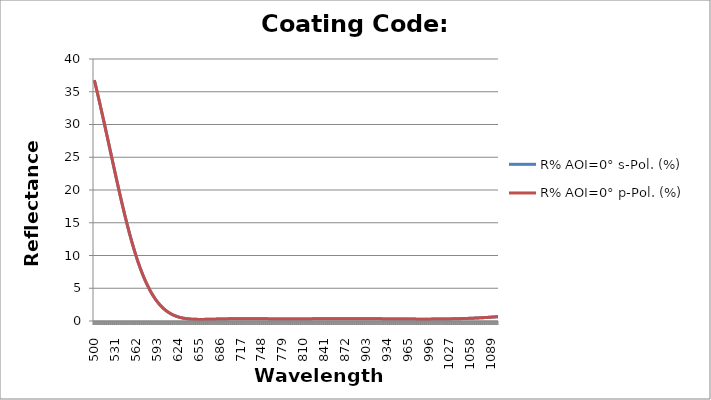
| Category | R% AOI=0° s-Pol. (%) | R% AOI=0° p-Pol. (%) |
|---|---|---|
| 500.0 | 36.773 | 36.773 |
| 501.0 | 36.354 | 36.354 |
| 502.0 | 35.929 | 35.929 |
| 503.0 | 35.499 | 35.499 |
| 504.0 | 35.064 | 35.064 |
| 505.0 | 34.623 | 34.623 |
| 506.0 | 34.178 | 34.178 |
| 507.0 | 33.729 | 33.729 |
| 508.0 | 33.275 | 33.275 |
| 509.0 | 32.817 | 32.817 |
| 510.0 | 32.355 | 32.355 |
| 511.0 | 31.903 | 31.903 |
| 512.0 | 31.448 | 31.448 |
| 513.0 | 30.989 | 30.989 |
| 514.0 | 30.528 | 30.528 |
| 515.0 | 30.065 | 30.065 |
| 516.0 | 29.6 | 29.6 |
| 517.0 | 29.132 | 29.132 |
| 518.0 | 28.663 | 28.663 |
| 519.0 | 28.192 | 28.192 |
| 520.0 | 27.72 | 27.72 |
| 521.0 | 27.248 | 27.248 |
| 522.0 | 26.774 | 26.774 |
| 523.0 | 26.3 | 26.3 |
| 524.0 | 25.826 | 25.826 |
| 525.0 | 25.353 | 25.353 |
| 526.0 | 24.879 | 24.879 |
| 527.0 | 24.406 | 24.406 |
| 528.0 | 23.934 | 23.934 |
| 529.0 | 23.463 | 23.463 |
| 530.0 | 22.993 | 22.993 |
| 531.0 | 22.525 | 22.525 |
| 532.0 | 22.059 | 22.059 |
| 533.0 | 21.594 | 21.594 |
| 534.0 | 21.132 | 21.132 |
| 535.0 | 20.673 | 20.673 |
| 536.0 | 20.216 | 20.216 |
| 537.0 | 19.762 | 19.762 |
| 538.0 | 19.312 | 19.312 |
| 539.0 | 18.865 | 18.865 |
| 540.0 | 18.421 | 18.421 |
| 541.0 | 17.981 | 17.981 |
| 542.0 | 17.546 | 17.546 |
| 543.0 | 17.114 | 17.114 |
| 544.0 | 16.687 | 16.687 |
| 545.0 | 16.264 | 16.264 |
| 546.0 | 15.846 | 15.846 |
| 547.0 | 15.433 | 15.433 |
| 548.0 | 15.025 | 15.025 |
| 549.0 | 14.622 | 14.622 |
| 550.0 | 14.224 | 14.224 |
| 551.0 | 13.833 | 13.833 |
| 552.0 | 13.447 | 13.447 |
| 553.0 | 13.066 | 13.066 |
| 554.0 | 12.692 | 12.692 |
| 555.0 | 12.323 | 12.323 |
| 556.0 | 11.96 | 11.96 |
| 557.0 | 11.604 | 11.604 |
| 558.0 | 11.253 | 11.253 |
| 559.0 | 10.909 | 10.909 |
| 560.0 | 10.571 | 10.571 |
| 561.0 | 10.239 | 10.239 |
| 562.0 | 9.914 | 9.914 |
| 563.0 | 9.595 | 9.595 |
| 564.0 | 9.283 | 9.283 |
| 565.0 | 8.977 | 8.977 |
| 566.0 | 8.678 | 8.678 |
| 567.0 | 8.385 | 8.385 |
| 568.0 | 8.099 | 8.099 |
| 569.0 | 7.822 | 7.822 |
| 570.0 | 7.552 | 7.552 |
| 571.0 | 7.289 | 7.289 |
| 572.0 | 7.031 | 7.031 |
| 573.0 | 6.78 | 6.78 |
| 574.0 | 6.535 | 6.535 |
| 575.0 | 6.297 | 6.297 |
| 576.0 | 6.064 | 6.064 |
| 577.0 | 5.838 | 5.838 |
| 578.0 | 5.618 | 5.618 |
| 579.0 | 5.404 | 5.404 |
| 580.0 | 5.196 | 5.196 |
| 581.0 | 4.994 | 4.994 |
| 582.0 | 4.797 | 4.797 |
| 583.0 | 4.607 | 4.607 |
| 584.0 | 4.422 | 4.422 |
| 585.0 | 4.243 | 4.243 |
| 586.0 | 4.069 | 4.069 |
| 587.0 | 3.901 | 3.901 |
| 588.0 | 3.738 | 3.738 |
| 589.0 | 3.581 | 3.581 |
| 590.0 | 3.428 | 3.428 |
| 591.0 | 3.281 | 3.281 |
| 592.0 | 3.139 | 3.139 |
| 593.0 | 3.002 | 3.002 |
| 594.0 | 2.869 | 2.869 |
| 595.0 | 2.741 | 2.741 |
| 596.0 | 2.618 | 2.618 |
| 597.0 | 2.499 | 2.499 |
| 598.0 | 2.385 | 2.385 |
| 599.0 | 2.275 | 2.275 |
| 600.0 | 2.17 | 2.17 |
| 601.0 | 2.068 | 2.068 |
| 602.0 | 1.97 | 1.97 |
| 603.0 | 1.877 | 1.877 |
| 604.0 | 1.787 | 1.787 |
| 605.0 | 1.701 | 1.701 |
| 606.0 | 1.618 | 1.618 |
| 607.0 | 1.539 | 1.539 |
| 608.0 | 1.463 | 1.463 |
| 609.0 | 1.391 | 1.391 |
| 610.0 | 1.322 | 1.322 |
| 611.0 | 1.256 | 1.256 |
| 612.0 | 1.193 | 1.193 |
| 613.0 | 1.133 | 1.133 |
| 614.0 | 1.076 | 1.076 |
| 615.0 | 1.021 | 1.021 |
| 616.0 | 0.969 | 0.969 |
| 617.0 | 0.92 | 0.92 |
| 618.0 | 0.873 | 0.873 |
| 619.0 | 0.829 | 0.829 |
| 620.0 | 0.787 | 0.787 |
| 621.0 | 0.747 | 0.747 |
| 622.0 | 0.71 | 0.71 |
| 623.0 | 0.674 | 0.674 |
| 624.0 | 0.64 | 0.64 |
| 625.0 | 0.609 | 0.609 |
| 626.0 | 0.579 | 0.579 |
| 627.0 | 0.551 | 0.551 |
| 628.0 | 0.525 | 0.525 |
| 629.0 | 0.5 | 0.5 |
| 630.0 | 0.477 | 0.477 |
| 631.0 | 0.455 | 0.455 |
| 632.0 | 0.435 | 0.435 |
| 633.0 | 0.416 | 0.416 |
| 634.0 | 0.399 | 0.399 |
| 635.0 | 0.382 | 0.382 |
| 636.0 | 0.367 | 0.367 |
| 637.0 | 0.354 | 0.354 |
| 638.0 | 0.341 | 0.341 |
| 639.0 | 0.329 | 0.329 |
| 640.0 | 0.318 | 0.318 |
| 641.0 | 0.308 | 0.308 |
| 642.0 | 0.3 | 0.3 |
| 643.0 | 0.292 | 0.292 |
| 644.0 | 0.284 | 0.284 |
| 645.0 | 0.278 | 0.278 |
| 646.0 | 0.272 | 0.272 |
| 647.0 | 0.267 | 0.267 |
| 648.0 | 0.262 | 0.262 |
| 649.0 | 0.258 | 0.258 |
| 650.0 | 0.255 | 0.255 |
| 651.0 | 0.252 | 0.252 |
| 652.0 | 0.25 | 0.25 |
| 653.0 | 0.248 | 0.248 |
| 654.0 | 0.246 | 0.246 |
| 655.0 | 0.245 | 0.245 |
| 656.0 | 0.244 | 0.244 |
| 657.0 | 0.244 | 0.244 |
| 658.0 | 0.244 | 0.244 |
| 659.0 | 0.244 | 0.244 |
| 660.0 | 0.244 | 0.244 |
| 661.0 | 0.245 | 0.245 |
| 662.0 | 0.246 | 0.246 |
| 663.0 | 0.247 | 0.247 |
| 664.0 | 0.249 | 0.249 |
| 665.0 | 0.25 | 0.25 |
| 666.0 | 0.252 | 0.252 |
| 667.0 | 0.254 | 0.254 |
| 668.0 | 0.256 | 0.256 |
| 669.0 | 0.258 | 0.258 |
| 670.0 | 0.26 | 0.26 |
| 671.0 | 0.262 | 0.262 |
| 672.0 | 0.265 | 0.265 |
| 673.0 | 0.267 | 0.267 |
| 674.0 | 0.27 | 0.27 |
| 675.0 | 0.272 | 0.272 |
| 676.0 | 0.274 | 0.274 |
| 677.0 | 0.277 | 0.277 |
| 678.0 | 0.28 | 0.28 |
| 679.0 | 0.282 | 0.282 |
| 680.0 | 0.285 | 0.285 |
| 681.0 | 0.287 | 0.287 |
| 682.0 | 0.29 | 0.29 |
| 683.0 | 0.292 | 0.292 |
| 684.0 | 0.295 | 0.295 |
| 685.0 | 0.297 | 0.297 |
| 686.0 | 0.3 | 0.3 |
| 687.0 | 0.302 | 0.302 |
| 688.0 | 0.304 | 0.304 |
| 689.0 | 0.307 | 0.307 |
| 690.0 | 0.309 | 0.309 |
| 691.0 | 0.311 | 0.311 |
| 692.0 | 0.313 | 0.313 |
| 693.0 | 0.315 | 0.315 |
| 694.0 | 0.317 | 0.317 |
| 695.0 | 0.319 | 0.319 |
| 696.0 | 0.321 | 0.321 |
| 697.0 | 0.322 | 0.322 |
| 698.0 | 0.324 | 0.324 |
| 699.0 | 0.326 | 0.326 |
| 700.0 | 0.327 | 0.327 |
| 701.0 | 0.328 | 0.328 |
| 702.0 | 0.33 | 0.33 |
| 703.0 | 0.331 | 0.331 |
| 704.0 | 0.332 | 0.332 |
| 705.0 | 0.334 | 0.334 |
| 706.0 | 0.335 | 0.335 |
| 707.0 | 0.336 | 0.336 |
| 708.0 | 0.336 | 0.336 |
| 709.0 | 0.337 | 0.337 |
| 710.0 | 0.338 | 0.338 |
| 711.0 | 0.339 | 0.339 |
| 712.0 | 0.339 | 0.339 |
| 713.0 | 0.34 | 0.34 |
| 714.0 | 0.34 | 0.34 |
| 715.0 | 0.341 | 0.341 |
| 716.0 | 0.341 | 0.341 |
| 717.0 | 0.342 | 0.342 |
| 718.0 | 0.342 | 0.342 |
| 719.0 | 0.342 | 0.342 |
| 720.0 | 0.342 | 0.342 |
| 721.0 | 0.342 | 0.342 |
| 722.0 | 0.342 | 0.342 |
| 723.0 | 0.342 | 0.342 |
| 724.0 | 0.342 | 0.342 |
| 725.0 | 0.342 | 0.342 |
| 726.0 | 0.342 | 0.342 |
| 727.0 | 0.342 | 0.342 |
| 728.0 | 0.341 | 0.341 |
| 729.0 | 0.341 | 0.341 |
| 730.0 | 0.341 | 0.341 |
| 731.0 | 0.34 | 0.34 |
| 732.0 | 0.34 | 0.34 |
| 733.0 | 0.34 | 0.34 |
| 734.0 | 0.339 | 0.339 |
| 735.0 | 0.339 | 0.339 |
| 736.0 | 0.338 | 0.338 |
| 737.0 | 0.338 | 0.338 |
| 738.0 | 0.337 | 0.337 |
| 739.0 | 0.337 | 0.337 |
| 740.0 | 0.336 | 0.336 |
| 741.0 | 0.336 | 0.336 |
| 742.0 | 0.335 | 0.335 |
| 743.0 | 0.334 | 0.334 |
| 744.0 | 0.334 | 0.334 |
| 745.0 | 0.333 | 0.333 |
| 746.0 | 0.333 | 0.333 |
| 747.0 | 0.332 | 0.332 |
| 748.0 | 0.331 | 0.331 |
| 749.0 | 0.33 | 0.33 |
| 750.0 | 0.33 | 0.33 |
| 751.0 | 0.329 | 0.329 |
| 752.0 | 0.328 | 0.328 |
| 753.0 | 0.327 | 0.327 |
| 754.0 | 0.327 | 0.327 |
| 755.0 | 0.326 | 0.326 |
| 756.0 | 0.325 | 0.325 |
| 757.0 | 0.325 | 0.325 |
| 758.0 | 0.324 | 0.324 |
| 759.0 | 0.323 | 0.323 |
| 760.0 | 0.323 | 0.323 |
| 761.0 | 0.322 | 0.322 |
| 762.0 | 0.321 | 0.321 |
| 763.0 | 0.321 | 0.321 |
| 764.0 | 0.32 | 0.32 |
| 765.0 | 0.32 | 0.32 |
| 766.0 | 0.319 | 0.319 |
| 767.0 | 0.318 | 0.318 |
| 768.0 | 0.318 | 0.318 |
| 769.0 | 0.318 | 0.318 |
| 770.0 | 0.317 | 0.317 |
| 771.0 | 0.317 | 0.317 |
| 772.0 | 0.316 | 0.316 |
| 773.0 | 0.316 | 0.316 |
| 774.0 | 0.315 | 0.315 |
| 775.0 | 0.315 | 0.315 |
| 776.0 | 0.315 | 0.315 |
| 777.0 | 0.314 | 0.314 |
| 778.0 | 0.314 | 0.314 |
| 779.0 | 0.314 | 0.314 |
| 780.0 | 0.314 | 0.314 |
| 781.0 | 0.314 | 0.314 |
| 782.0 | 0.313 | 0.313 |
| 783.0 | 0.313 | 0.313 |
| 784.0 | 0.313 | 0.313 |
| 785.0 | 0.313 | 0.313 |
| 786.0 | 0.313 | 0.313 |
| 787.0 | 0.313 | 0.313 |
| 788.0 | 0.313 | 0.313 |
| 789.0 | 0.313 | 0.313 |
| 790.0 | 0.313 | 0.313 |
| 791.0 | 0.313 | 0.313 |
| 792.0 | 0.313 | 0.313 |
| 793.0 | 0.313 | 0.313 |
| 794.0 | 0.313 | 0.313 |
| 795.0 | 0.313 | 0.313 |
| 796.0 | 0.313 | 0.313 |
| 797.0 | 0.314 | 0.314 |
| 798.0 | 0.314 | 0.314 |
| 799.0 | 0.314 | 0.314 |
| 800.0 | 0.314 | 0.314 |
| 801.0 | 0.315 | 0.315 |
| 802.0 | 0.315 | 0.315 |
| 803.0 | 0.315 | 0.315 |
| 804.0 | 0.316 | 0.316 |
| 805.0 | 0.316 | 0.316 |
| 806.0 | 0.316 | 0.316 |
| 807.0 | 0.317 | 0.317 |
| 808.0 | 0.317 | 0.317 |
| 809.0 | 0.317 | 0.317 |
| 810.0 | 0.318 | 0.318 |
| 811.0 | 0.318 | 0.318 |
| 812.0 | 0.319 | 0.319 |
| 813.0 | 0.319 | 0.319 |
| 814.0 | 0.32 | 0.32 |
| 815.0 | 0.32 | 0.32 |
| 816.0 | 0.321 | 0.321 |
| 817.0 | 0.321 | 0.321 |
| 818.0 | 0.322 | 0.322 |
| 819.0 | 0.322 | 0.322 |
| 820.0 | 0.323 | 0.323 |
| 821.0 | 0.323 | 0.323 |
| 822.0 | 0.324 | 0.324 |
| 823.0 | 0.324 | 0.324 |
| 824.0 | 0.325 | 0.325 |
| 825.0 | 0.326 | 0.326 |
| 826.0 | 0.326 | 0.326 |
| 827.0 | 0.327 | 0.327 |
| 828.0 | 0.327 | 0.327 |
| 829.0 | 0.328 | 0.328 |
| 830.0 | 0.328 | 0.328 |
| 831.0 | 0.329 | 0.329 |
| 832.0 | 0.33 | 0.33 |
| 833.0 | 0.33 | 0.33 |
| 834.0 | 0.331 | 0.331 |
| 835.0 | 0.331 | 0.331 |
| 836.0 | 0.332 | 0.332 |
| 837.0 | 0.332 | 0.332 |
| 838.0 | 0.333 | 0.333 |
| 839.0 | 0.334 | 0.334 |
| 840.0 | 0.334 | 0.334 |
| 841.0 | 0.335 | 0.335 |
| 842.0 | 0.335 | 0.335 |
| 843.0 | 0.336 | 0.336 |
| 844.0 | 0.336 | 0.336 |
| 845.0 | 0.337 | 0.337 |
| 846.0 | 0.337 | 0.337 |
| 847.0 | 0.338 | 0.338 |
| 848.0 | 0.338 | 0.338 |
| 849.0 | 0.339 | 0.339 |
| 850.0 | 0.339 | 0.339 |
| 851.0 | 0.34 | 0.34 |
| 852.0 | 0.34 | 0.34 |
| 853.0 | 0.341 | 0.341 |
| 854.0 | 0.341 | 0.341 |
| 855.0 | 0.342 | 0.342 |
| 856.0 | 0.342 | 0.342 |
| 857.0 | 0.342 | 0.342 |
| 858.0 | 0.343 | 0.343 |
| 859.0 | 0.343 | 0.343 |
| 860.0 | 0.344 | 0.344 |
| 861.0 | 0.344 | 0.344 |
| 862.0 | 0.344 | 0.344 |
| 863.0 | 0.344 | 0.344 |
| 864.0 | 0.345 | 0.345 |
| 865.0 | 0.345 | 0.345 |
| 866.0 | 0.345 | 0.345 |
| 867.0 | 0.346 | 0.346 |
| 868.0 | 0.346 | 0.346 |
| 869.0 | 0.346 | 0.346 |
| 870.0 | 0.346 | 0.346 |
| 871.0 | 0.346 | 0.346 |
| 872.0 | 0.346 | 0.346 |
| 873.0 | 0.346 | 0.346 |
| 874.0 | 0.347 | 0.347 |
| 875.0 | 0.347 | 0.347 |
| 876.0 | 0.347 | 0.347 |
| 877.0 | 0.347 | 0.347 |
| 878.0 | 0.347 | 0.347 |
| 879.0 | 0.347 | 0.347 |
| 880.0 | 0.347 | 0.347 |
| 881.0 | 0.347 | 0.347 |
| 882.0 | 0.347 | 0.347 |
| 883.0 | 0.347 | 0.347 |
| 884.0 | 0.347 | 0.347 |
| 885.0 | 0.346 | 0.346 |
| 886.0 | 0.346 | 0.346 |
| 887.0 | 0.346 | 0.346 |
| 888.0 | 0.346 | 0.346 |
| 889.0 | 0.346 | 0.346 |
| 890.0 | 0.346 | 0.346 |
| 891.0 | 0.345 | 0.345 |
| 892.0 | 0.345 | 0.345 |
| 893.0 | 0.345 | 0.345 |
| 894.0 | 0.344 | 0.344 |
| 895.0 | 0.344 | 0.344 |
| 896.0 | 0.344 | 0.344 |
| 897.0 | 0.343 | 0.343 |
| 898.0 | 0.343 | 0.343 |
| 899.0 | 0.342 | 0.342 |
| 900.0 | 0.342 | 0.342 |
| 901.0 | 0.342 | 0.342 |
| 902.0 | 0.341 | 0.341 |
| 903.0 | 0.341 | 0.341 |
| 904.0 | 0.34 | 0.34 |
| 905.0 | 0.34 | 0.34 |
| 906.0 | 0.339 | 0.339 |
| 907.0 | 0.338 | 0.338 |
| 908.0 | 0.338 | 0.338 |
| 909.0 | 0.337 | 0.337 |
| 910.0 | 0.337 | 0.337 |
| 911.0 | 0.336 | 0.336 |
| 912.0 | 0.335 | 0.335 |
| 913.0 | 0.335 | 0.335 |
| 914.0 | 0.334 | 0.334 |
| 915.0 | 0.333 | 0.333 |
| 916.0 | 0.333 | 0.333 |
| 917.0 | 0.332 | 0.332 |
| 918.0 | 0.331 | 0.331 |
| 919.0 | 0.33 | 0.33 |
| 920.0 | 0.33 | 0.33 |
| 921.0 | 0.329 | 0.329 |
| 922.0 | 0.328 | 0.328 |
| 923.0 | 0.327 | 0.327 |
| 924.0 | 0.326 | 0.326 |
| 925.0 | 0.326 | 0.326 |
| 926.0 | 0.325 | 0.325 |
| 927.0 | 0.324 | 0.324 |
| 928.0 | 0.323 | 0.323 |
| 929.0 | 0.322 | 0.322 |
| 930.0 | 0.322 | 0.322 |
| 931.0 | 0.321 | 0.321 |
| 932.0 | 0.32 | 0.32 |
| 933.0 | 0.319 | 0.319 |
| 934.0 | 0.318 | 0.318 |
| 935.0 | 0.317 | 0.317 |
| 936.0 | 0.316 | 0.316 |
| 937.0 | 0.315 | 0.315 |
| 938.0 | 0.314 | 0.314 |
| 939.0 | 0.314 | 0.314 |
| 940.0 | 0.313 | 0.313 |
| 941.0 | 0.312 | 0.312 |
| 942.0 | 0.311 | 0.311 |
| 943.0 | 0.31 | 0.31 |
| 944.0 | 0.309 | 0.309 |
| 945.0 | 0.308 | 0.308 |
| 946.0 | 0.307 | 0.307 |
| 947.0 | 0.306 | 0.306 |
| 948.0 | 0.306 | 0.306 |
| 949.0 | 0.305 | 0.305 |
| 950.0 | 0.304 | 0.304 |
| 951.0 | 0.303 | 0.303 |
| 952.0 | 0.302 | 0.302 |
| 953.0 | 0.301 | 0.301 |
| 954.0 | 0.301 | 0.301 |
| 955.0 | 0.3 | 0.3 |
| 956.0 | 0.299 | 0.299 |
| 957.0 | 0.298 | 0.298 |
| 958.0 | 0.297 | 0.297 |
| 959.0 | 0.297 | 0.297 |
| 960.0 | 0.296 | 0.296 |
| 961.0 | 0.295 | 0.295 |
| 962.0 | 0.294 | 0.294 |
| 963.0 | 0.294 | 0.294 |
| 964.0 | 0.293 | 0.293 |
| 965.0 | 0.292 | 0.292 |
| 966.0 | 0.292 | 0.292 |
| 967.0 | 0.291 | 0.291 |
| 968.0 | 0.29 | 0.29 |
| 969.0 | 0.29 | 0.29 |
| 970.0 | 0.289 | 0.289 |
| 971.0 | 0.289 | 0.289 |
| 972.0 | 0.288 | 0.288 |
| 973.0 | 0.288 | 0.288 |
| 974.0 | 0.287 | 0.287 |
| 975.0 | 0.287 | 0.287 |
| 976.0 | 0.286 | 0.286 |
| 977.0 | 0.286 | 0.286 |
| 978.0 | 0.285 | 0.285 |
| 979.0 | 0.285 | 0.285 |
| 980.0 | 0.285 | 0.285 |
| 981.0 | 0.284 | 0.284 |
| 982.0 | 0.284 | 0.284 |
| 983.0 | 0.284 | 0.284 |
| 984.0 | 0.284 | 0.284 |
| 985.0 | 0.284 | 0.284 |
| 986.0 | 0.284 | 0.284 |
| 987.0 | 0.283 | 0.283 |
| 988.0 | 0.283 | 0.283 |
| 989.0 | 0.283 | 0.283 |
| 990.0 | 0.283 | 0.283 |
| 991.0 | 0.283 | 0.283 |
| 992.0 | 0.284 | 0.284 |
| 993.0 | 0.284 | 0.284 |
| 994.0 | 0.284 | 0.284 |
| 995.0 | 0.284 | 0.284 |
| 996.0 | 0.284 | 0.284 |
| 997.0 | 0.285 | 0.285 |
| 998.0 | 0.285 | 0.285 |
| 999.0 | 0.285 | 0.285 |
| 1000.0 | 0.286 | 0.286 |
| 1001.0 | 0.286 | 0.286 |
| 1002.0 | 0.287 | 0.287 |
| 1003.0 | 0.287 | 0.287 |
| 1004.0 | 0.288 | 0.288 |
| 1005.0 | 0.289 | 0.289 |
| 1006.0 | 0.289 | 0.289 |
| 1007.0 | 0.29 | 0.29 |
| 1008.0 | 0.291 | 0.291 |
| 1009.0 | 0.292 | 0.292 |
| 1010.0 | 0.293 | 0.293 |
| 1011.0 | 0.294 | 0.294 |
| 1012.0 | 0.295 | 0.295 |
| 1013.0 | 0.296 | 0.296 |
| 1014.0 | 0.297 | 0.297 |
| 1015.0 | 0.298 | 0.298 |
| 1016.0 | 0.3 | 0.3 |
| 1017.0 | 0.301 | 0.301 |
| 1018.0 | 0.302 | 0.302 |
| 1019.0 | 0.304 | 0.304 |
| 1020.0 | 0.305 | 0.305 |
| 1021.0 | 0.307 | 0.307 |
| 1022.0 | 0.308 | 0.308 |
| 1023.0 | 0.31 | 0.31 |
| 1024.0 | 0.312 | 0.312 |
| 1025.0 | 0.314 | 0.314 |
| 1026.0 | 0.316 | 0.316 |
| 1027.0 | 0.317 | 0.317 |
| 1028.0 | 0.319 | 0.319 |
| 1029.0 | 0.322 | 0.322 |
| 1030.0 | 0.324 | 0.324 |
| 1031.0 | 0.326 | 0.326 |
| 1032.0 | 0.328 | 0.328 |
| 1033.0 | 0.33 | 0.33 |
| 1034.0 | 0.333 | 0.333 |
| 1035.0 | 0.335 | 0.335 |
| 1036.0 | 0.338 | 0.338 |
| 1037.0 | 0.34 | 0.34 |
| 1038.0 | 0.343 | 0.343 |
| 1039.0 | 0.346 | 0.346 |
| 1040.0 | 0.349 | 0.349 |
| 1041.0 | 0.352 | 0.352 |
| 1042.0 | 0.355 | 0.355 |
| 1043.0 | 0.358 | 0.358 |
| 1044.0 | 0.361 | 0.361 |
| 1045.0 | 0.364 | 0.364 |
| 1046.0 | 0.368 | 0.368 |
| 1047.0 | 0.371 | 0.371 |
| 1048.0 | 0.374 | 0.374 |
| 1049.0 | 0.378 | 0.378 |
| 1050.0 | 0.381 | 0.381 |
| 1051.0 | 0.385 | 0.385 |
| 1052.0 | 0.389 | 0.389 |
| 1053.0 | 0.393 | 0.393 |
| 1054.0 | 0.397 | 0.397 |
| 1055.0 | 0.401 | 0.401 |
| 1056.0 | 0.405 | 0.405 |
| 1057.0 | 0.409 | 0.409 |
| 1058.0 | 0.413 | 0.413 |
| 1059.0 | 0.418 | 0.418 |
| 1060.0 | 0.422 | 0.422 |
| 1061.0 | 0.426 | 0.426 |
| 1062.0 | 0.431 | 0.431 |
| 1063.0 | 0.436 | 0.436 |
| 1064.0 | 0.44 | 0.44 |
| 1065.0 | 0.445 | 0.445 |
| 1066.0 | 0.45 | 0.45 |
| 1067.0 | 0.455 | 0.455 |
| 1068.0 | 0.46 | 0.46 |
| 1069.0 | 0.466 | 0.466 |
| 1070.0 | 0.471 | 0.471 |
| 1071.0 | 0.476 | 0.476 |
| 1072.0 | 0.482 | 0.482 |
| 1073.0 | 0.487 | 0.487 |
| 1074.0 | 0.493 | 0.493 |
| 1075.0 | 0.498 | 0.498 |
| 1076.0 | 0.504 | 0.504 |
| 1077.0 | 0.51 | 0.51 |
| 1078.0 | 0.516 | 0.516 |
| 1079.0 | 0.522 | 0.522 |
| 1080.0 | 0.528 | 0.528 |
| 1081.0 | 0.535 | 0.535 |
| 1082.0 | 0.541 | 0.541 |
| 1083.0 | 0.548 | 0.548 |
| 1084.0 | 0.554 | 0.554 |
| 1085.0 | 0.561 | 0.561 |
| 1086.0 | 0.567 | 0.567 |
| 1087.0 | 0.574 | 0.574 |
| 1088.0 | 0.581 | 0.581 |
| 1089.0 | 0.588 | 0.588 |
| 1090.0 | 0.595 | 0.595 |
| 1091.0 | 0.602 | 0.602 |
| 1092.0 | 0.61 | 0.61 |
| 1093.0 | 0.617 | 0.617 |
| 1094.0 | 0.624 | 0.624 |
| 1095.0 | 0.632 | 0.632 |
| 1096.0 | 0.64 | 0.64 |
| 1097.0 | 0.648 | 0.648 |
| 1098.0 | 0.655 | 0.655 |
| 1099.0 | 0.663 | 0.663 |
| 1100.0 | 0.671 | 0.671 |